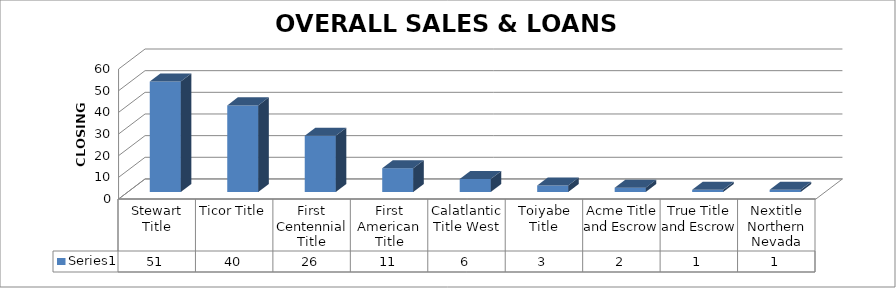
| Category | Series 0 |
|---|---|
| Stewart Title | 51 |
| Ticor Title | 40 |
| First Centennial Title | 26 |
| First American Title | 11 |
| Calatlantic Title West | 6 |
| Toiyabe Title | 3 |
| Acme Title and Escrow | 2 |
| True Title and Escrow | 1 |
| Nextitle Northern Nevada | 1 |